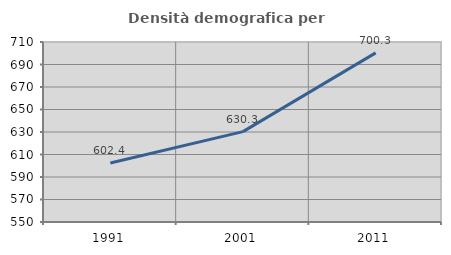
| Category | Densità demografica |
|---|---|
| 1991.0 | 602.379 |
| 2001.0 | 630.319 |
| 2011.0 | 700.336 |